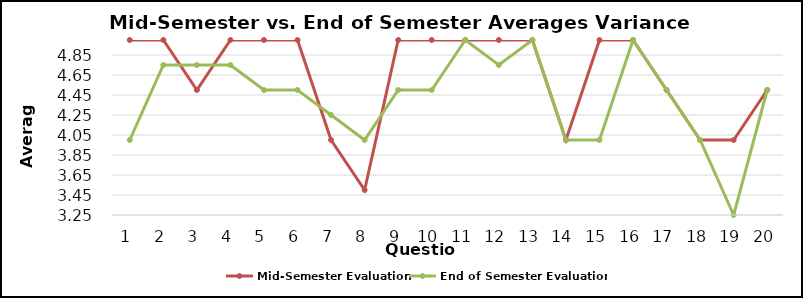
| Category | Mid-Semester Evaluation | End of Semester Evaluation |
|---|---|---|
| 0 | 5 | 4 |
| 1 | 5 | 4.75 |
| 2 | 4.5 | 4.75 |
| 3 | 5 | 4.75 |
| 4 | 5 | 4.5 |
| 5 | 5 | 4.5 |
| 6 | 4 | 4.25 |
| 7 | 3.5 | 4 |
| 8 | 5 | 4.5 |
| 9 | 5 | 4.5 |
| 10 | 5 | 5 |
| 11 | 5 | 4.75 |
| 12 | 5 | 5 |
| 13 | 4 | 4 |
| 14 | 5 | 4 |
| 15 | 5 | 5 |
| 16 | 4.5 | 4.5 |
| 17 | 4 | 4 |
| 18 | 4 | 3.25 |
| 19 | 4.5 | 4.5 |